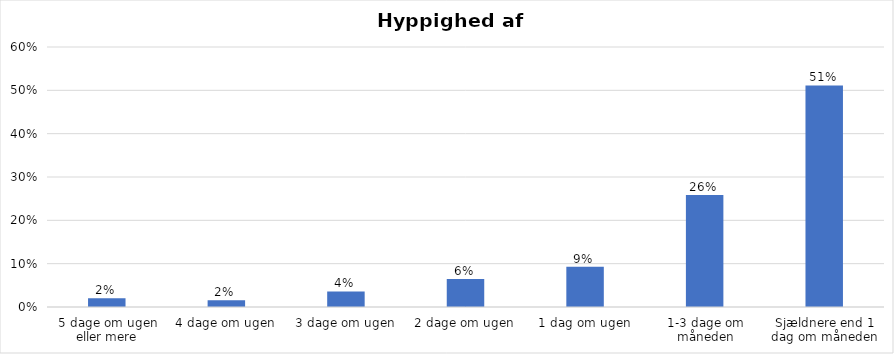
| Category | % |
|---|---|
| 5 dage om ugen eller mere | 0.02 |
| 4 dage om ugen | 0.016 |
| 3 dage om ugen | 0.036 |
| 2 dage om ugen | 0.065 |
| 1 dag om ugen | 0.093 |
| 1-3 dage om måneden | 0.259 |
| Sjældnere end 1 dag om måneden | 0.511 |